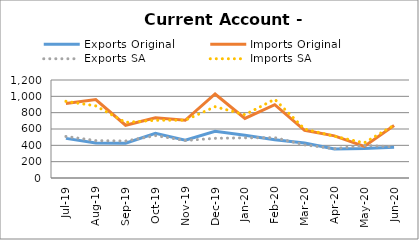
| Category | Exports Original | Imports Original | Exports SA | Imports SA |
|---|---|---|---|---|
| 2019-07-11 | 485 | 913 | 509 | 939 |
| 2019-08-11 | 430 | 961 | 458 | 883 |
| 2019-09-11 | 427 | 646 | 453 | 681 |
| 2019-10-11 | 546 | 738 | 519 | 707 |
| 2019-11-11 | 464 | 707 | 459 | 708 |
| 2019-12-11 | 572 | 1029 | 486 | 873 |
| 2020-01-11 | 524 | 730 | 492 | 775 |
| 2020-02-11 | 469 | 898 | 494 | 964 |
| 2020-03-11 | 428 | 584 | 406 | 600 |
| 2020-04-11 | 354 | 516 | 359 | 511 |
| 2020-05-11 | 361 | 387 | 399 | 430 |
| 2020-06-11 | 377 | 644 | 382 | 647 |